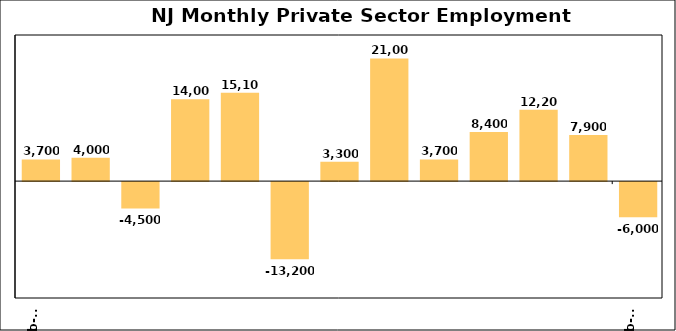
| Category | Series 0 |
|---|---|
| 2023-02-12 | 3700 |
| 2023-03-12 | 4000 |
| 2023-04-12 | -4500 |
| 2023-05-12 | 14000 |
| 2023-06-12 | 15100 |
| 2023-07-12 | -13200 |
| 2023-08-12 | 3300 |
| 2023-09-12 | 21000 |
| 2023-10-12 | 3700 |
| 2023-11-12 | 8400 |
| 2023-12-12 | 12200 |
| 2024-01-12 | 7900 |
| 2024-02-12 | -6000 |